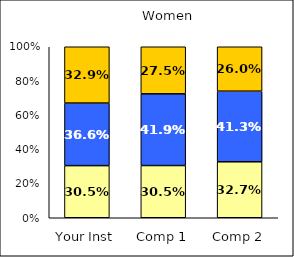
| Category | Low Habits of Mind | Average Habits of Mind | High Habits of Mind |
|---|---|---|---|
| Your Inst | 0.305 | 0.366 | 0.329 |
| Comp 1 | 0.305 | 0.419 | 0.275 |
| Comp 2 | 0.327 | 0.413 | 0.26 |